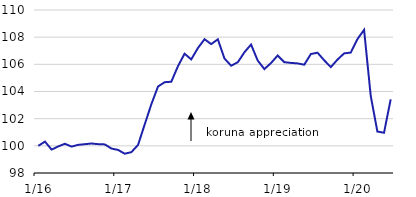
| Category | NEER |
|---|---|
|  1/16 | 100 |
| 2 | 100.311 |
| 3 | 99.722 |
| 4 | 99.957 |
| 5 | 100.15 |
| 6 | 99.945 |
| 7 | 100.072 |
| 8 | 100.122 |
| 9 | 100.17 |
| 10 | 100.124 |
| 11 | 100.104 |
| 12 | 99.8 |
|  1/17 | 99.698 |
| 2 | 99.42 |
| 3 | 99.537 |
| 4 | 100.066 |
| 5 | 101.576 |
| 6 | 103.059 |
| 7 | 104.365 |
| 8 | 104.685 |
| 9 | 104.718 |
| 10 | 105.861 |
| 11 | 106.783 |
| 12 | 106.363 |
|  1/18 | 107.196 |
| 2 | 107.851 |
| 3 | 107.488 |
| 4 | 107.841 |
| 5 | 106.429 |
| 6 | 105.9 |
| 7 | 106.152 |
| 8 | 106.888 |
| 9 | 107.457 |
| 10 | 106.277 |
| 11 | 105.651 |
| 12 | 106.095 |
|  1/19 | 106.648 |
| 2 | 106.159 |
| 3 | 106.106 |
| 4 | 106.069 |
| 5 | 105.972 |
| 6 | 106.761 |
| 7 | 106.855 |
| 8 | 106.297 |
| 9 | 105.794 |
| 10 | 106.349 |
| 11 | 106.806 |
| 12 | 106.866 |
|  1/20 | 107.859 |
| 2 | 108.539 |
| 3 | 103.677 |
| 4 | 101.053 |
| 5 | 100.962 |
| 6 | 103.422 |